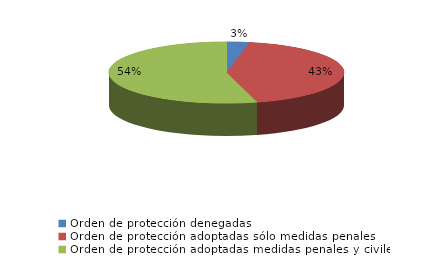
| Category | Series 0 |
|---|---|
| Orden de protección denegadas | 19 |
| Orden de protección adoptadas sólo medidas penales | 261 |
| Orden de protección adoptadas medidas penales y civiles | 331 |